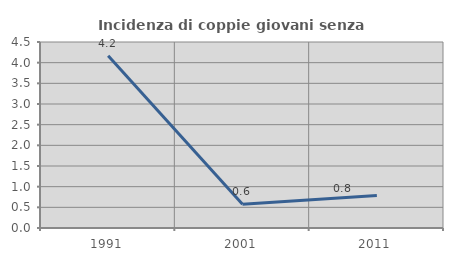
| Category | Incidenza di coppie giovani senza figli |
|---|---|
| 1991.0 | 4.167 |
| 2001.0 | 0.575 |
| 2011.0 | 0.787 |